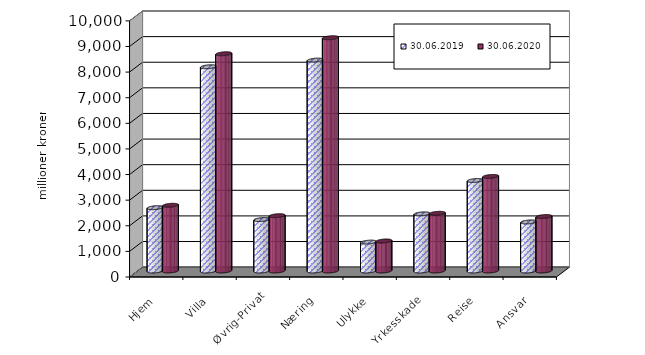
| Category | 30.06.2019 | 30.06.2020 |
|---|---|---|
| Hjem | 2472.878 | 2566.104 |
| Villa | 7974.474 | 8481.898 |
| Øvrig-Privat | 2009.696 | 2159.75 |
| Næring | 8233.94 | 9107.191 |
| Ulykke | 1128.025 | 1172.187 |
| Yrkesskade | 2230.809 | 2252.681 |
| Reise | 3534.404 | 3691.481 |
| Ansvar | 1916.641 | 2126.718 |